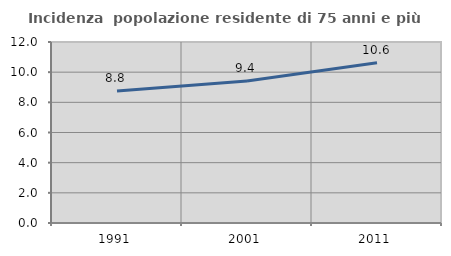
| Category | Incidenza  popolazione residente di 75 anni e più |
|---|---|
| 1991.0 | 8.757 |
| 2001.0 | 9.416 |
| 2011.0 | 10.622 |